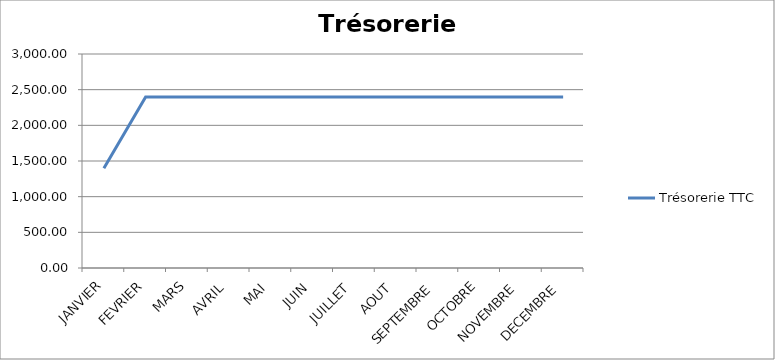
| Category | Trésorerie TTC |
|---|---|
| JANVIER | 1398.8 |
| FEVRIER | 2398.8 |
| MARS | 2398.8 |
| AVRIL | 2398.8 |
| MAI | 2398.8 |
| JUIN | 2398.8 |
| JUILLET | 2398.8 |
| AOUT | 2398.8 |
| SEPTEMBRE | 2398.8 |
| OCTOBRE | 2398.8 |
| NOVEMBRE | 2398.8 |
| DECEMBRE | 2398.8 |